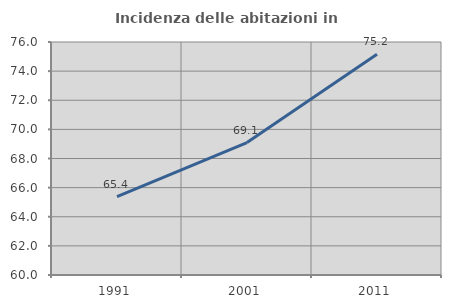
| Category | Incidenza delle abitazioni in proprietà  |
|---|---|
| 1991.0 | 65.375 |
| 2001.0 | 69.092 |
| 2011.0 | 75.165 |